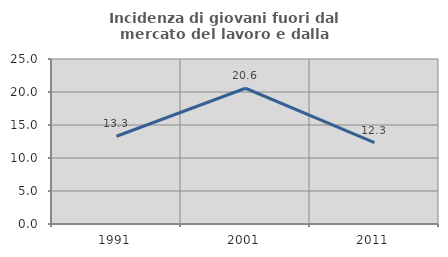
| Category | Incidenza di giovani fuori dal mercato del lavoro e dalla formazione  |
|---|---|
| 1991.0 | 13.291 |
| 2001.0 | 20.567 |
| 2011.0 | 12.346 |